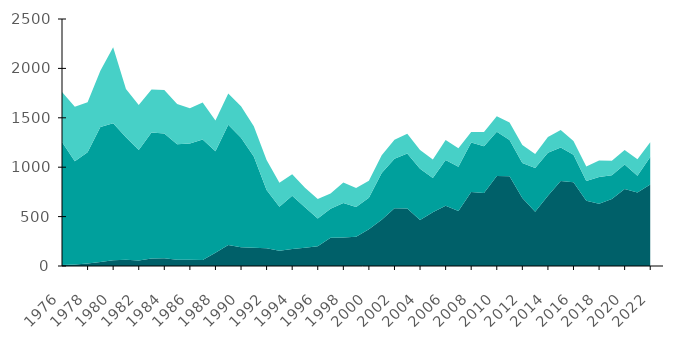
| Category | Glyfosaatti | Fenoksihapot | Muut herbisidit |
|---|---|---|---|
| 1976-01-01 | 9.6 | 1244.9 | 507.5 |
| 1977-01-01 | 15.7 | 1044.4 | 552.5 |
| 1978-01-01 | 25.2 | 1126.8 | 504.6 |
| 1979-01-01 | 39.9 | 1366.4 | 569 |
| 1980-01-01 | 59.4 | 1385.8 | 767.7 |
| 1981-01-01 | 63.1 | 1239 | 489 |
| 1982-01-01 | 56.9 | 1116.6 | 456.5 |
| 1983-01-01 | 76.2 | 1274.9 | 436.5 |
| 1984-01-01 | 79.4 | 1262.2 | 440.9 |
| 1985-01-01 | 62.2 | 1170.8 | 405.7 |
| 1986-01-01 | 62.3 | 1177.4 | 358 |
| 1987-01-01 | 60.7 | 1218.5 | 375.3 |
| 1988-01-01 | 133.7 | 1027.4 | 311.5 |
| 1989-01-01 | 212.5 | 1216 | 316.8 |
| 1990-01-01 | 190.3 | 1106.8 | 320.3 |
| 1991-01-01 | 183.6 | 923.8 | 306.1 |
| 1992-01-01 | 179.1 | 589.1 | 303.5 |
| 1993-01-01 | 153.5 | 445 | 244.3 |
| 1994-01-01 | 171.4 | 539.1 | 218.7 |
| 1995-01-01 | 184.2 | 411.3 | 195.9 |
| 1996-01-01 | 199 | 281.4 | 196.9 |
| 1997-01-01 | 284.7 | 295.8 | 153.4 |
| 1998-01-01 | 288.5 | 349.6 | 205.8 |
| 1999-01-01 | 297.2 | 300.4 | 192.6 |
| 2000-01-01 | 372.6 | 317.1 | 172.7 |
| 2001-01-01 | 468.8 | 473.5 | 177.8 |
| 2002-01-01 | 585.6 | 500.3 | 191.9 |
| 2003-01-01 | 581.1 | 558.7 | 199.6 |
| 2004-01-01 | 466.6 | 516.9 | 190.8 |
| 2005-01-01 | 543.2 | 347.5 | 186.6 |
| 2006-01-01 | 609.1 | 464.8 | 200.2 |
| 2007-01-01 | 557.4 | 447 | 186.8 |
| 2008-01-01 | 748.5 | 500.5 | 108.2 |
| 2009-01-01 | 738.8 | 473.7 | 142.6 |
| 2010-01-01 | 912.1 | 447.4 | 155.7 |
| 2011-01-01 | 908.1 | 366.4 | 177.6 |
| 2012-01-01 | 687.5 | 355.9 | 180.4 |
| 2013-01-01 | 549.5 | 442.8 | 140.6 |
| 2014-01-01 | 710.2 | 434.8 | 160.7 |
| 2015-01-01 | 859.3 | 339.8 | 177.9 |
| 2016-01-01 | 847.7 | 279.1 | 138.6 |
| 2017-01-01 | 661.2 | 197.9 | 148 |
| 2018-01-01 | 630.3 | 270.6 | 166.606 |
| 2019-01-01 | 678.4 | 239.5 | 146.4 |
| 2020-01-01 | 778.3 | 247.8 | 148.6 |
| 2021-01-01 | 745 | 168.7 | 167.8 |
| 2022-01-01 | 825.4 | 278.3 | 148.5 |